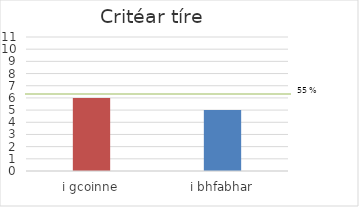
| Category | tíortha |
|---|---|
| i gcoinne | 6 |
| i bhfabhar | 5 |